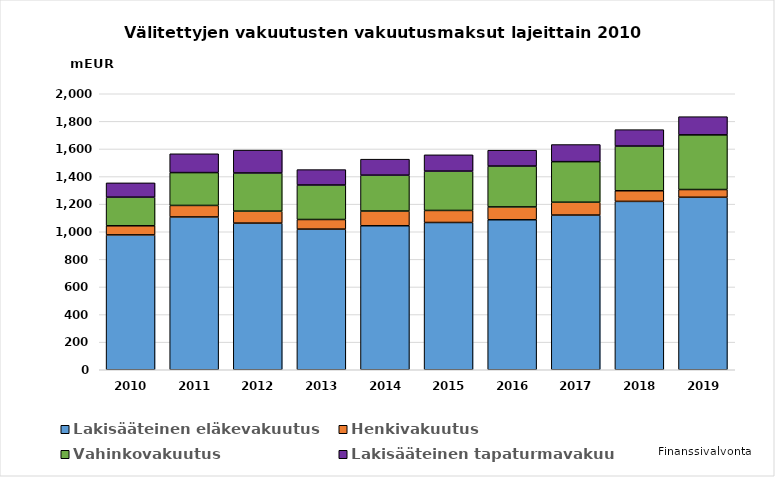
| Category | Lakisääteinen eläkevakuutus | Henkivakuutus | Vahinkovakuutus | Lakisääteinen tapaturmavakuutus |
|---|---|---|---|---|
| 2010.0 | 977.321 | 65.95 | 207.341 | 103.558 |
| 2011.0 | 1107.329 | 83.403 | 238.041 | 136.289 |
| 2012.0 | 1062.705 | 86.597 | 276.62 | 165.706 |
| 2013.0 | 1019.216 | 69.648 | 249.823 | 111.515 |
| 2014.0 | 1043.573 | 106.619 | 259.835 | 115.957 |
| 2015.0 | 1067.062 | 87.285 | 284.943 | 118.153 |
| 2016.0 | 1087 | 93 | 296 | 115 |
| 2017.0 | 1121 | 93 | 294 | 124 |
| 2018.0 | 1220 | 77 | 324 | 119 |
| 2019.0 | 1250 | 56 | 396 | 132 |